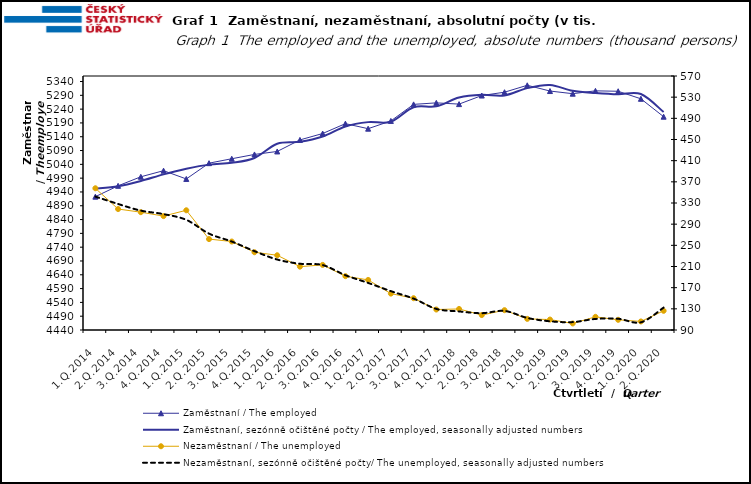
| Category | Zaměstnaní / The employed | Zaměstnaní, sezónně očištěné počty / The employed, seasonally adjusted numbers |
|---|---|---|
| 1.Q.2014 | 4922.963 | 4952.405 |
| 2.Q.2014 | 4962.219 | 4960.65 |
| 3.Q.2014 | 4994.947 | 4979.618 |
| 4.Q.2014 | 5017.051 | 5003.629 |
| 1.Q.2015 | 4987.141 | 5023.827 |
| 2.Q.2015 | 5044.285 | 5038.984 |
| 3.Q.2015 | 5060.3 | 5045.647 |
| 4.Q.2015 | 5075.884 | 5063.085 |
| 1.Q.2016 | 5086.671 | 5114.698 |
| 2.Q.2016 | 5128.493 | 5121.602 |
| 3.Q.2016 | 5151.712 | 5140.967 |
| 4.Q.2016 | 5187.436 | 5177.35 |
| 1.Q.2017 | 5169.203 | 5192.941 |
| 2.Q.2017 | 5197.265 | 5194.555 |
| 3.Q.2017 | 5257.26 | 5246.726 |
| 4.Q.2017 | 5262.691 | 5250.237 |
| 1.Q.2018 | 5258.225 | 5281.99 |
| 2.Q.2018 | 5289.242 | 5291.982 |
| 3.Q.2018 | 5301.361 | 5289.641 |
| 4.Q.2018 | 5326.327 | 5316.128 |
| 1.Q.2019 | 5305.534 | 5327.565 |
| 2.Q.2019 | 5295.929 | 5306.306 |
| 3.Q.2019 | 5306.247 | 5298.103 |
| 4.Q.2019 | 5304.7 | 5293.467 |
| 1.Q.2020 | 5277.418 | 5294.602 |
| 2.Q.2020 | 5212.593 | 5229.332 |